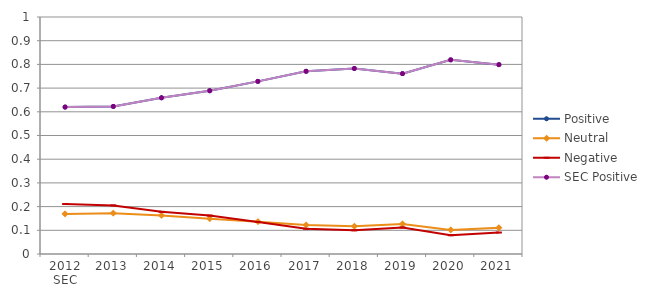
| Category | Positive | Neutral | Negative | SEC Positive |
|---|---|---|---|---|
| 0 | 0.62 | 0.169 | 0.211 | 0.62 |
| 1 | 0.623 | 0.172 | 0.205 | 0.623 |
| 2 | 0.659 | 0.163 | 0.178 | 0.659 |
| 3 | 0.689 | 0.149 | 0.162 | 0.689 |
| 4 | 0.728 | 0.137 | 0.135 | 0.728 |
| 5 | 0.771 | 0.123 | 0.106 | 0.771 |
| 6 | 0.783 | 0.117 | 0.1 | 0.783 |
| 7 | 0.761 | 0.127 | 0.112 | 0.761 |
| 8 | 0.819 | 0.102 | 0.079 | 0.819 |
| 9 | 0.799 | 0.11 | 0.091 | 0.799 |